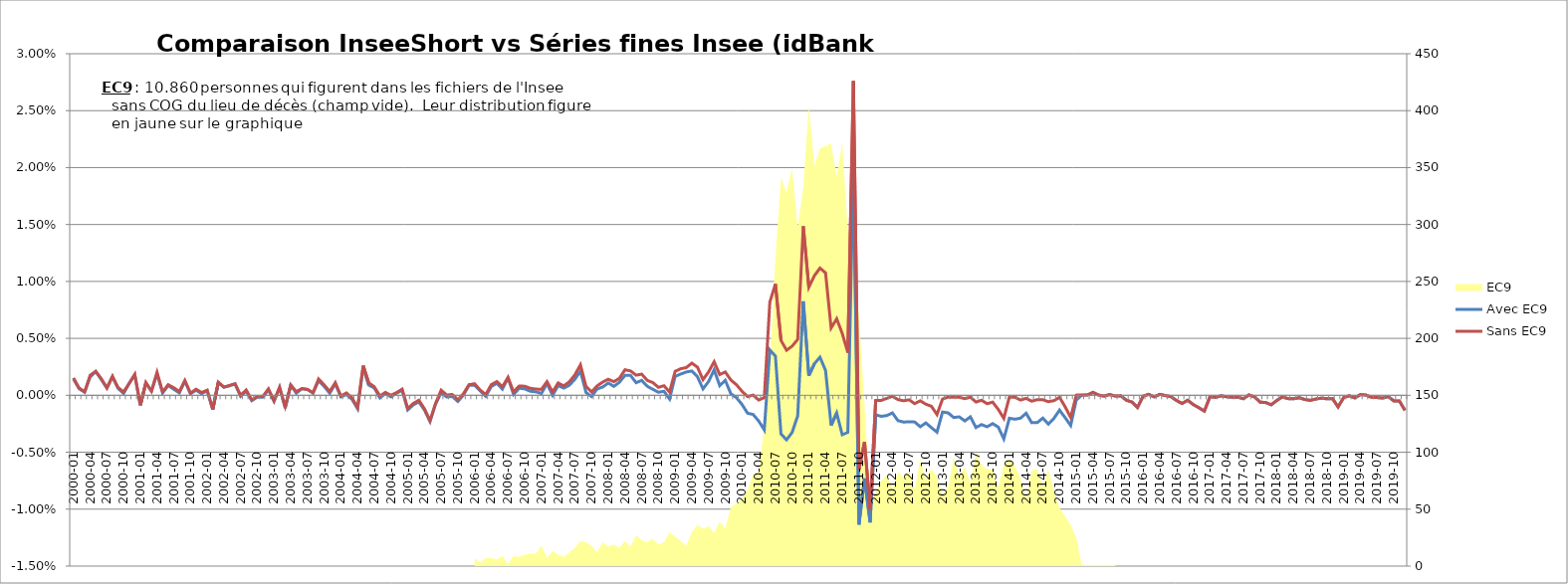
| Category | Avec EC9 | Sans EC9 |
|---|---|---|
| 2000-01 | 0.001 | 0.002 |
| 2000-02 | 0.001 | 0.001 |
| 2000-03 | 0 | 0 |
| 2000-04 | 0.002 | 0.002 |
| 2000-05 | 0.002 | 0.002 |
| 2000-06 | 0.001 | 0.001 |
| 2000-07 | 0.001 | 0.001 |
| 2000-08 | 0.002 | 0.002 |
| 2000-09 | 0.001 | 0.001 |
| 2000-10 | 0 | 0 |
| 2000-11 | 0.001 | 0.001 |
| 2000-12 | 0.002 | 0.002 |
| 2001-01 | -0.001 | -0.001 |
| 2001-02 | 0.001 | 0.001 |
| 2001-03 | 0 | 0 |
| 2001-04 | 0.002 | 0.002 |
| 2001-05 | 0 | 0 |
| 2001-06 | 0.001 | 0.001 |
| 2001-07 | 0.001 | 0.001 |
| 2001-08 | 0 | 0 |
| 2001-09 | 0.001 | 0.001 |
| 2001-10 | 0 | 0 |
| 2001-11 | 0 | 0.001 |
| 2001-12 | 0 | 0 |
| 2002-01 | 0 | 0 |
| 2002-02 | -0.001 | -0.001 |
| 2002-03 | 0.001 | 0.001 |
| 2002-04 | 0.001 | 0.001 |
| 2002-05 | 0.001 | 0.001 |
| 2002-06 | 0.001 | 0.001 |
| 2002-07 | 0 | 0 |
| 2002-08 | 0 | 0 |
| 2002-09 | 0 | 0 |
| 2002-10 | 0 | 0 |
| 2002-11 | 0 | 0 |
| 2002-12 | 0 | 0.001 |
| 2003-01 | -0.001 | 0 |
| 2003-02 | 0.001 | 0.001 |
| 2003-03 | -0.001 | -0.001 |
| 2003-04 | 0.001 | 0.001 |
| 2003-05 | 0 | 0 |
| 2003-06 | 0.001 | 0.001 |
| 2003-07 | 0.001 | 0.001 |
| 2003-08 | 0 | 0 |
| 2003-09 | 0.001 | 0.001 |
| 2003-10 | 0.001 | 0.001 |
| 2003-11 | 0 | 0 |
| 2003-12 | 0.001 | 0.001 |
| 2004-01 | 0 | 0 |
| 2004-02 | 0 | 0 |
| 2004-03 | 0 | 0 |
| 2004-04 | -0.001 | -0.001 |
| 2004-05 | 0.002 | 0.003 |
| 2004-06 | 0.001 | 0.001 |
| 2004-07 | 0.001 | 0.001 |
| 2004-08 | 0 | 0 |
| 2004-09 | 0 | 0 |
| 2004-10 | 0 | 0 |
| 2004-11 | 0 | 0 |
| 2004-12 | 0 | 0.001 |
| 2005-01 | -0.001 | -0.001 |
| 2005-02 | -0.001 | -0.001 |
| 2005-03 | -0.001 | 0 |
| 2005-04 | -0.001 | -0.001 |
| 2005-05 | -0.002 | -0.002 |
| 2005-06 | -0.001 | -0.001 |
| 2005-07 | 0 | 0 |
| 2005-08 | 0 | 0 |
| 2005-09 | 0 | 0 |
| 2005-10 | -0.001 | 0 |
| 2005-11 | 0 | 0 |
| 2005-12 | 0.001 | 0.001 |
| 2006-01 | 0.001 | 0.001 |
| 2006-02 | 0 | 0 |
| 2006-03 | 0 | 0 |
| 2006-04 | 0.001 | 0.001 |
| 2006-05 | 0.001 | 0.001 |
| 2006-06 | 0.001 | 0.001 |
| 2006-07 | 0.002 | 0.002 |
| 2006-08 | 0 | 0 |
| 2006-09 | 0.001 | 0.001 |
| 2006-10 | 0.001 | 0.001 |
| 2006-11 | 0 | 0.001 |
| 2006-12 | 0 | 0.001 |
| 2007-01 | 0 | 0.001 |
| 2007-02 | 0.001 | 0.001 |
| 2007-03 | 0 | 0 |
| 2007-04 | 0.001 | 0.001 |
| 2007-05 | 0.001 | 0.001 |
| 2007-06 | 0.001 | 0.001 |
| 2007-07 | 0.001 | 0.002 |
| 2007-08 | 0.002 | 0.003 |
| 2007-09 | 0 | 0.001 |
| 2007-10 | 0 | 0 |
| 2007-11 | 0.001 | 0.001 |
| 2007-12 | 0.001 | 0.001 |
| 2008-01 | 0.001 | 0.001 |
| 2008-02 | 0.001 | 0.001 |
| 2008-03 | 0.001 | 0.001 |
| 2008-04 | 0.002 | 0.002 |
| 2008-05 | 0.002 | 0.002 |
| 2008-06 | 0.001 | 0.002 |
| 2008-07 | 0.001 | 0.002 |
| 2008-08 | 0.001 | 0.001 |
| 2008-09 | 0.001 | 0.001 |
| 2008-10 | 0 | 0.001 |
| 2008-11 | 0 | 0.001 |
| 2008-12 | 0 | 0 |
| 2009-01 | 0.002 | 0.002 |
| 2009-02 | 0.002 | 0.002 |
| 2009-03 | 0.002 | 0.002 |
| 2009-04 | 0.002 | 0.003 |
| 2009-05 | 0.002 | 0.002 |
| 2009-06 | 0.001 | 0.001 |
| 2009-07 | 0.001 | 0.002 |
| 2009-08 | 0.002 | 0.003 |
| 2009-09 | 0.001 | 0.002 |
| 2009-10 | 0.001 | 0.002 |
| 2009-11 | 0 | 0.001 |
| 2009-12 | 0 | 0.001 |
| 2010-01 | -0.001 | 0 |
| 2010-02 | -0.002 | 0 |
| 2010-03 | -0.002 | 0 |
| 2010-04 | -0.002 | 0 |
| 2010-05 | -0.003 | 0 |
| 2010-06 | 0.004 | 0.008 |
| 2010-07 | 0.003 | 0.01 |
| 2010-08 | -0.003 | 0.005 |
| 2010-09 | -0.004 | 0.004 |
| 2010-10 | -0.003 | 0.004 |
| 2010-11 | -0.002 | 0.005 |
| 2010-12 | 0.008 | 0.015 |
| 2011-01 | 0.002 | 0.009 |
| 2011-02 | 0.003 | 0.011 |
| 2011-03 | 0.003 | 0.011 |
| 2011-04 | 0.002 | 0.011 |
| 2011-05 | -0.003 | 0.006 |
| 2011-06 | -0.002 | 0.007 |
| 2011-07 | -0.003 | 0.005 |
| 2011-08 | -0.003 | 0.004 |
| 2011-09 | 0.02 | 0.028 |
| 2011-10 | -0.011 | -0.006 |
| 2011-11 | -0.007 | -0.004 |
| 2011-12 | -0.011 | -0.01 |
| 2012-01 | -0.002 | 0 |
| 2012-02 | -0.002 | 0 |
| 2012-03 | -0.002 | 0 |
| 2012-04 | -0.002 | 0 |
| 2012-05 | -0.002 | 0 |
| 2012-06 | -0.002 | 0 |
| 2012-07 | -0.002 | 0 |
| 2012-08 | -0.002 | -0.001 |
| 2012-09 | -0.003 | 0 |
| 2012-10 | -0.002 | -0.001 |
| 2012-11 | -0.003 | -0.001 |
| 2012-12 | -0.003 | -0.002 |
| 2013-01 | -0.001 | 0 |
| 2013-02 | -0.002 | 0 |
| 2013-03 | -0.002 | 0 |
| 2013-04 | -0.002 | 0 |
| 2013-05 | -0.002 | 0 |
| 2013-06 | -0.002 | 0 |
| 2013-07 | -0.003 | -0.001 |
| 2013-08 | -0.003 | 0 |
| 2013-09 | -0.003 | -0.001 |
| 2013-10 | -0.002 | -0.001 |
| 2013-11 | -0.003 | -0.001 |
| 2013-12 | -0.004 | -0.002 |
| 2014-01 | -0.002 | 0 |
| 2014-02 | -0.002 | 0 |
| 2014-03 | -0.002 | 0 |
| 2014-04 | -0.002 | 0 |
| 2014-05 | -0.002 | -0.001 |
| 2014-06 | -0.002 | 0 |
| 2014-07 | -0.002 | 0 |
| 2014-08 | -0.003 | -0.001 |
| 2014-09 | -0.002 | 0 |
| 2014-10 | -0.001 | 0 |
| 2014-11 | -0.002 | -0.001 |
| 2014-12 | -0.003 | -0.002 |
| 2015-01 | 0 | 0 |
| 2015-02 | 0 | 0 |
| 2015-03 | 0 | 0 |
| 2015-04 | 0 | 0 |
| 2015-05 | 0 | 0 |
| 2015-06 | 0 | 0 |
| 2015-07 | 0 | 0 |
| 2015-08 | 0 | 0 |
| 2015-09 | 0 | 0 |
| 2015-10 | 0 | 0 |
| 2015-11 | -0.001 | -0.001 |
| 2015-12 | -0.001 | -0.001 |
| 2016-01 | 0 | 0 |
| 2016-02 | 0 | 0 |
| 2016-03 | 0 | 0 |
| 2016-04 | 0 | 0 |
| 2016-05 | 0 | 0 |
| 2016-06 | 0 | 0 |
| 2016-07 | 0 | 0 |
| 2016-08 | -0.001 | -0.001 |
| 2016-09 | 0 | 0 |
| 2016-10 | -0.001 | -0.001 |
| 2016-11 | -0.001 | -0.001 |
| 2016-12 | -0.001 | -0.001 |
| 2017-01 | 0 | 0 |
| 2017-02 | 0 | 0 |
| 2017-03 | 0 | 0 |
| 2017-04 | 0 | 0 |
| 2017-05 | 0 | 0 |
| 2017-06 | 0 | 0 |
| 2017-07 | 0 | 0 |
| 2017-08 | 0 | 0 |
| 2017-09 | 0 | 0 |
| 2017-10 | -0.001 | -0.001 |
| 2017-11 | -0.001 | -0.001 |
| 2017-12 | -0.001 | -0.001 |
| 2018-01 | 0 | 0 |
| 2018-02 | 0 | 0 |
| 2018-03 | 0 | 0 |
| 2018-04 | 0 | 0 |
| 2018-05 | 0 | 0 |
| 2018-06 | 0 | 0 |
| 2018-07 | 0 | 0 |
| 2018-08 | 0 | 0 |
| 2018-09 | 0 | 0 |
| 2018-10 | 0 | 0 |
| 2018-11 | 0 | 0 |
| 2018-12 | -0.001 | -0.001 |
| 2019-01 | 0 | 0 |
| 2019-02 | 0 | 0 |
| 2019-03 | 0 | 0 |
| 2019-04 | 0 | 0 |
| 2019-05 | 0 | 0 |
| 2019-06 | 0 | 0 |
| 2019-07 | 0 | 0 |
| 2019-08 | 0 | 0 |
| 2019-09 | 0 | 0 |
| 2019-10 | 0 | 0 |
| 2019-11 | 0 | 0 |
| 2019-12 | -0.001 | -0.001 |